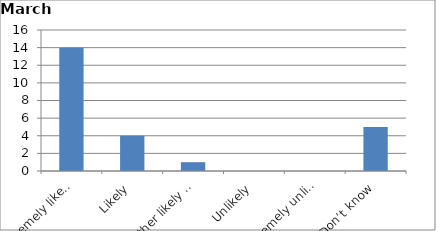
| Category | Series 0 |
|---|---|
| Extremely likely | 14 |
| Likely | 4 |
| Neither likely nor unlikely | 1 |
| Unlikely | 0 |
| Extremely unlikely | 0 |
| Don’t know | 5 |